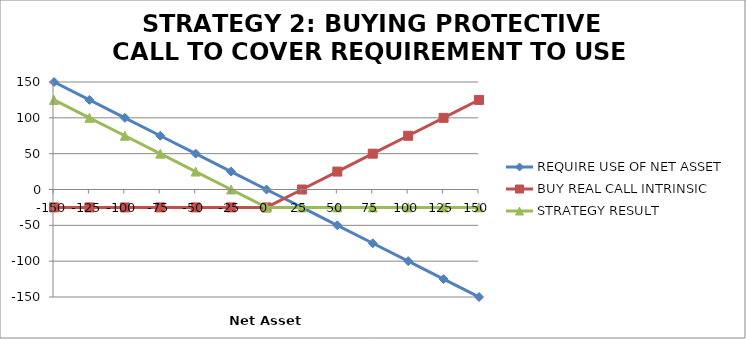
| Category | REQUIRE USE OF NET ASSET | BUY REAL CALL INTRINSIC | STRATEGY RESULT |
|---|---|---|---|
| -150.0 | 150 | -25 | 125 |
| -125.0 | 125 | -25 | 100 |
| -100.0 | 100 | -25 | 75 |
| -75.0 | 75 | -25 | 50 |
| -50.0 | 50 | -25 | 25 |
| -25.0 | 25 | -25 | 0 |
| 0.0 | 0 | -25 | -25 |
| 25.0 | -25 | 0 | -25 |
| 50.0 | -50 | 25 | -25 |
| 75.0 | -75 | 50 | -25 |
| 100.0 | -100 | 75 | -25 |
| 125.0 | -125 | 100 | -25 |
| 150.0 | -150 | 125 | -25 |